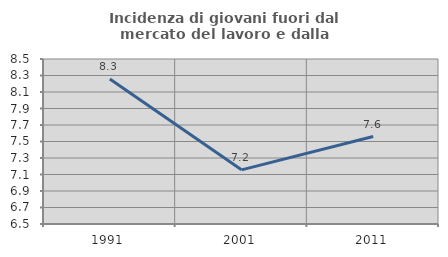
| Category | Incidenza di giovani fuori dal mercato del lavoro e dalla formazione  |
|---|---|
| 1991.0 | 8.257 |
| 2001.0 | 7.157 |
| 2011.0 | 7.56 |